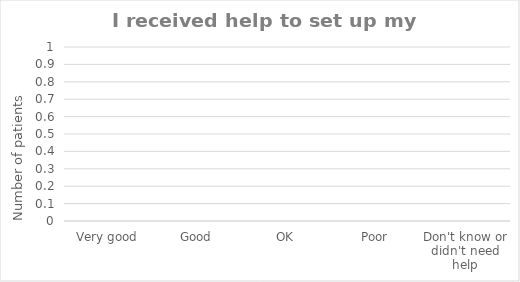
| Category | Series 0 |
|---|---|
| Very good | 0 |
| Good | 0 |
| OK | 0 |
| Poor | 0 |
| Don't know or didn't need help | 0 |